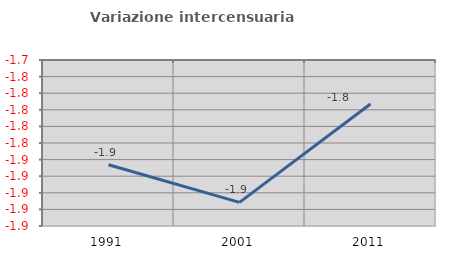
| Category | Variazione intercensuaria annua |
|---|---|
| 1991.0 | -1.866 |
| 2001.0 | -1.912 |
| 2011.0 | -1.793 |